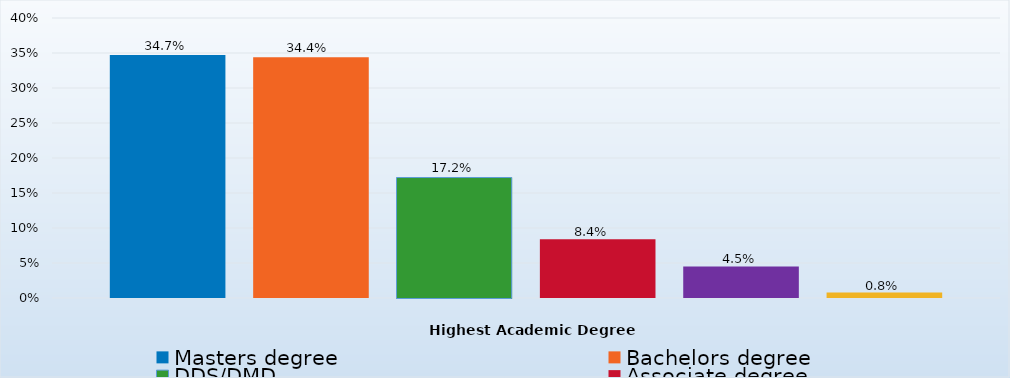
| Category | Masters degree | Bachelors degree | DDS/DMD | Associate degree | Doctorate degree | Certificate/Diploma/Other |
|---|---|---|---|---|---|---|
| Percent | 0.347 | 0.344 | 0.172 | 0.084 | 0.045 | 0.008 |